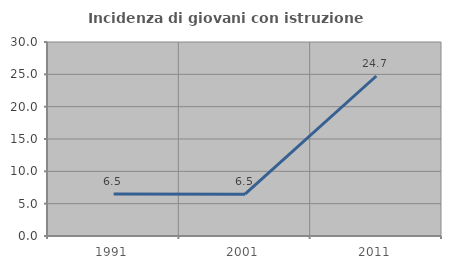
| Category | Incidenza di giovani con istruzione universitaria |
|---|---|
| 1991.0 | 6.504 |
| 2001.0 | 6.475 |
| 2011.0 | 24.742 |